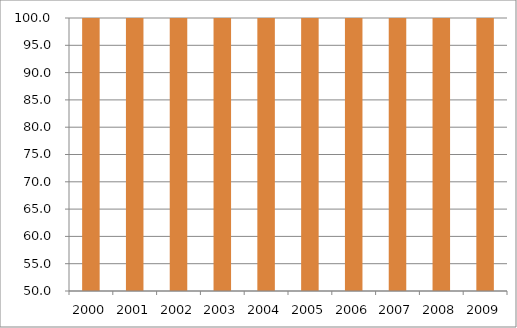
| Category | Região Nordeste |
|---|---|
| 2000.0 | 114.28 |
| 2001.0 | 117.62 |
| 2002.0 | 113.79 |
| 2003.0 | 111.7 |
| 2004.0 | 108.51 |
| 2005.0 | 107.57 |
| 2006.0 | 115.72 |
| 2007.0 | 117.54 |
| 2008.0 | 110.85 |
| 2009.0 | 108.6 |